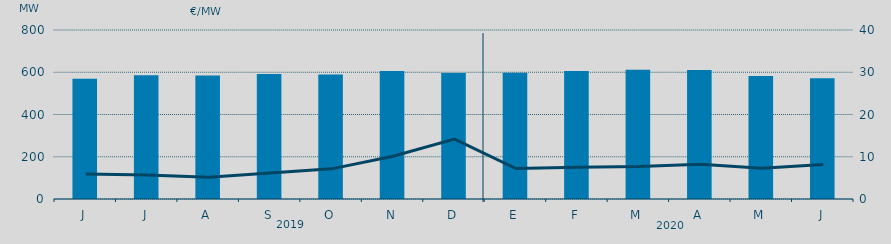
| Category | Energia (MWh) a subir |
|---|---|
| J | 569.496 |
| J | 585.727 |
| A | 584.609 |
| S | 591.64 |
| O | 589.349 |
| N | 605.422 |
| D | 596.999 |
| E | 597.488 |
| F | 605.632 |
| M | 611.351 |
| A | 610.483 |
| M | 582.745 |
| J | 571.897 |